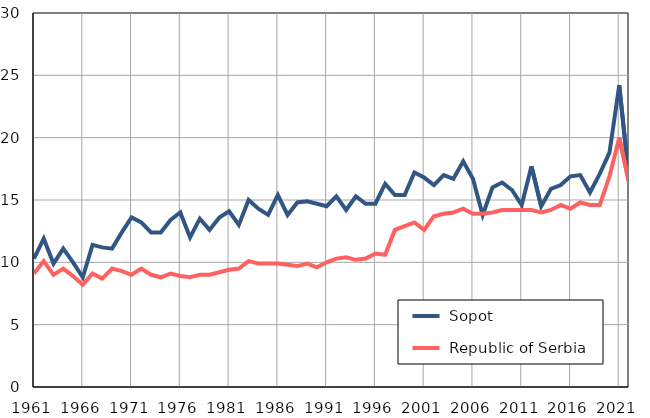
| Category |  Sopot |  Republic of Serbia |
|---|---|---|
| 1961.0 | 10.3 | 9.1 |
| 1962.0 | 11.9 | 10.1 |
| 1963.0 | 9.9 | 9 |
| 1964.0 | 11.1 | 9.5 |
| 1965.0 | 10 | 8.9 |
| 1966.0 | 8.8 | 8.2 |
| 1967.0 | 11.4 | 9.1 |
| 1968.0 | 11.2 | 8.7 |
| 1969.0 | 11.1 | 9.5 |
| 1970.0 | 12.4 | 9.3 |
| 1971.0 | 13.6 | 9 |
| 1972.0 | 13.2 | 9.5 |
| 1973.0 | 12.4 | 9 |
| 1974.0 | 12.4 | 8.8 |
| 1975.0 | 13.4 | 9.1 |
| 1976.0 | 14 | 8.9 |
| 1977.0 | 12 | 8.8 |
| 1978.0 | 13.5 | 9 |
| 1979.0 | 12.6 | 9 |
| 1980.0 | 13.6 | 9.2 |
| 1981.0 | 14.1 | 9.4 |
| 1982.0 | 13 | 9.5 |
| 1983.0 | 15 | 10.1 |
| 1984.0 | 14.3 | 9.9 |
| 1985.0 | 13.8 | 9.9 |
| 1986.0 | 15.4 | 9.9 |
| 1987.0 | 13.8 | 9.8 |
| 1988.0 | 14.8 | 9.7 |
| 1989.0 | 14.9 | 9.9 |
| 1990.0 | 14.7 | 9.6 |
| 1991.0 | 14.5 | 10 |
| 1992.0 | 15.3 | 10.3 |
| 1993.0 | 14.2 | 10.4 |
| 1994.0 | 15.3 | 10.2 |
| 1995.0 | 14.7 | 10.3 |
| 1996.0 | 14.7 | 10.7 |
| 1997.0 | 16.3 | 10.6 |
| 1998.0 | 15.4 | 12.6 |
| 1999.0 | 15.4 | 12.9 |
| 2000.0 | 17.2 | 13.2 |
| 2001.0 | 16.8 | 12.6 |
| 2002.0 | 16.2 | 13.7 |
| 2003.0 | 17 | 13.9 |
| 2004.0 | 16.7 | 14 |
| 2005.0 | 18.1 | 14.3 |
| 2006.0 | 16.7 | 13.9 |
| 2007.0 | 13.8 | 13.9 |
| 2008.0 | 16 | 14 |
| 2009.0 | 16.4 | 14.2 |
| 2010.0 | 15.8 | 14.2 |
| 2011.0 | 14.6 | 14.2 |
| 2012.0 | 17.7 | 14.2 |
| 2013.0 | 14.5 | 14 |
| 2014.0 | 15.9 | 14.2 |
| 2015.0 | 16.2 | 14.6 |
| 2016.0 | 16.9 | 14.3 |
| 2017.0 | 17 | 14.8 |
| 2018.0 | 15.6 | 14.6 |
| 2019.0 | 17.1 | 14.6 |
| 2020.0 | 18.8 | 16.9 |
| 2021.0 | 24.2 | 20 |
| 2022.0 | 16.7 | 16.4 |